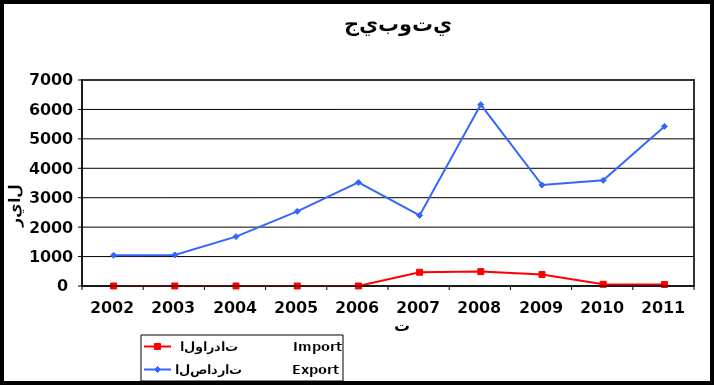
| Category |  الواردات           Import | الصادرات          Export |
|---|---|---|
| 2002.0 | 1 | 1044 |
| 2003.0 | 1 | 1055 |
| 2004.0 | 1 | 1677 |
| 2005.0 | 0 | 2536 |
| 2006.0 | 1 | 3519 |
| 2007.0 | 468 | 2399 |
| 2008.0 | 489 | 6163 |
| 2009.0 | 390 | 3430 |
| 2010.0 | 58 | 3591 |
| 2011.0 | 49 | 5424 |